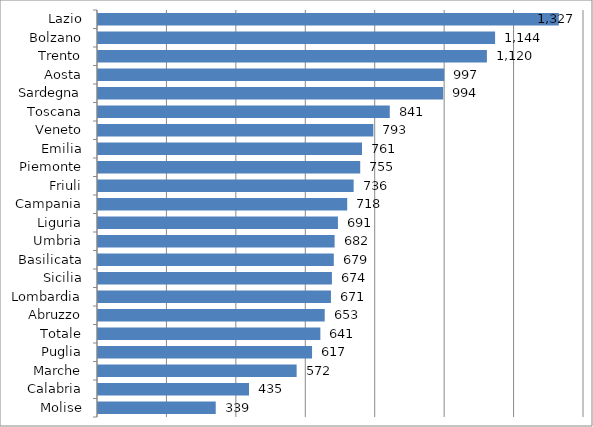
| Category | Series 0 |
|---|---|
| Lazio | 1327.44 |
| Bolzano | 1143.876 |
| Trento | 1120.321 |
| Aosta | 997.225 |
| Sardegna | 994.401 |
| Toscana | 840.514 |
| Veneto | 793.187 |
| Emilia | 760.53 |
| Piemonte | 755.335 |
| Friuli | 736.48 |
| Campania | 717.859 |
| Liguria | 691.17 |
| Umbria | 681.61 |
| Basilicata | 679.254 |
| Sicilia | 673.837 |
| Lombardia | 671.06 |
| Abruzzo | 653.061 |
| Totale | 640.545 |
| Puglia | 616.63 |
| Marche | 572.215 |
| Calabria | 435.015 |
| Molise | 339.142 |